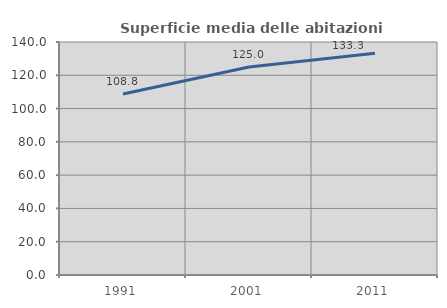
| Category | Superficie media delle abitazioni occupate |
|---|---|
| 1991.0 | 108.757 |
| 2001.0 | 124.987 |
| 2011.0 | 133.251 |